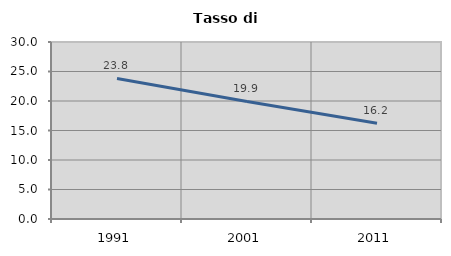
| Category | Tasso di disoccupazione   |
|---|---|
| 1991.0 | 23.822 |
| 2001.0 | 19.916 |
| 2011.0 | 16.236 |